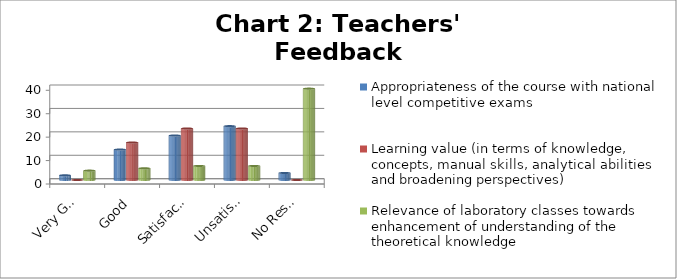
| Category | Appropriateness of the course with national level competitive exams | Learning value (in terms of knowledge, concepts, manual skills, analytical abilities and broadening perspectives) | Relevance of laboratory classes towards enhancement of understanding of the theoretical knowledge |
|---|---|---|---|
| Very Good | 2 | 0 | 4 |
| Good | 13 | 16 | 5 |
| Satisfactory | 19 | 22 | 6 |
| Unsatisfactory | 23 | 22 | 6 |
| No Response | 3 | 0 | 39 |